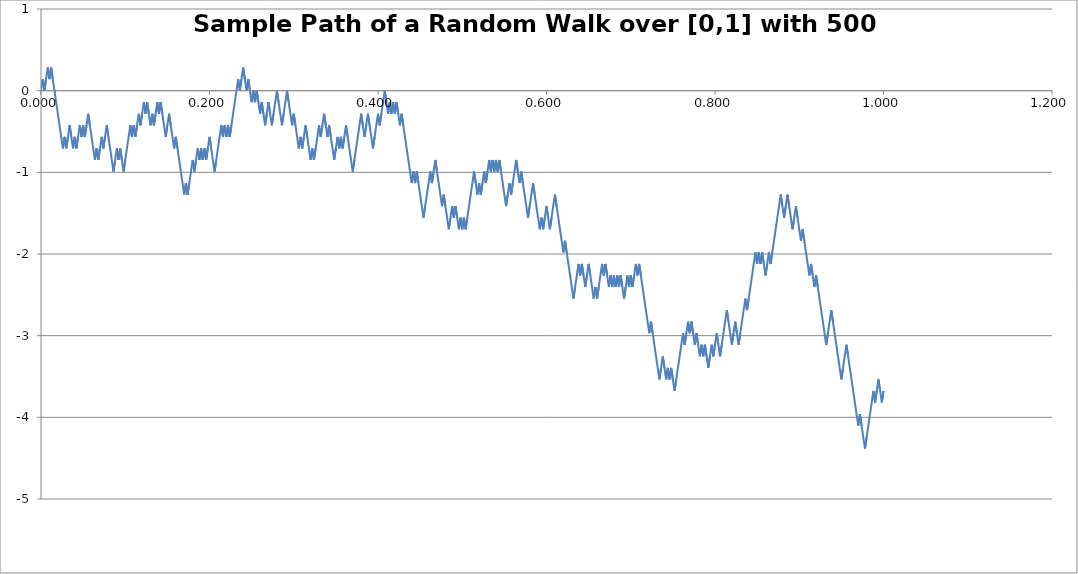
| Category | W_i |
|---|---|
| 0.0 | 0 |
| 0.002 | 0.141 |
| 0.004 | 0 |
| 0.006 | 0.141 |
| 0.008 | 0.283 |
| 0.01 | 0.141 |
| 0.012 | 0.283 |
| 0.014 | 0.141 |
| 0.016 | 0 |
| 0.018000000000000002 | -0.141 |
| 0.020000000000000004 | -0.283 |
| 0.022000000000000006 | -0.424 |
| 0.024000000000000007 | -0.566 |
| 0.02600000000000001 | -0.707 |
| 0.02800000000000001 | -0.566 |
| 0.030000000000000013 | -0.707 |
| 0.032000000000000015 | -0.566 |
| 0.034000000000000016 | -0.424 |
| 0.03600000000000002 | -0.566 |
| 0.03800000000000002 | -0.707 |
| 0.04000000000000002 | -0.566 |
| 0.04200000000000002 | -0.707 |
| 0.044000000000000025 | -0.566 |
| 0.04600000000000003 | -0.424 |
| 0.04800000000000003 | -0.566 |
| 0.05000000000000003 | -0.424 |
| 0.05200000000000003 | -0.566 |
| 0.054000000000000034 | -0.424 |
| 0.056000000000000036 | -0.283 |
| 0.05800000000000004 | -0.424 |
| 0.06000000000000004 | -0.566 |
| 0.06200000000000004 | -0.707 |
| 0.06400000000000004 | -0.849 |
| 0.06600000000000004 | -0.707 |
| 0.06800000000000005 | -0.849 |
| 0.07000000000000005 | -0.707 |
| 0.07200000000000005 | -0.566 |
| 0.07400000000000005 | -0.707 |
| 0.07600000000000005 | -0.566 |
| 0.07800000000000006 | -0.424 |
| 0.08000000000000006 | -0.566 |
| 0.08200000000000006 | -0.707 |
| 0.08400000000000006 | -0.849 |
| 0.08600000000000006 | -0.99 |
| 0.08800000000000006 | -0.849 |
| 0.09000000000000007 | -0.707 |
| 0.09200000000000007 | -0.849 |
| 0.09400000000000007 | -0.707 |
| 0.09600000000000007 | -0.849 |
| 0.09800000000000007 | -0.99 |
| 0.10000000000000007 | -0.849 |
| 0.10200000000000008 | -0.707 |
| 0.10400000000000008 | -0.566 |
| 0.10600000000000008 | -0.424 |
| 0.10800000000000008 | -0.566 |
| 0.11000000000000008 | -0.424 |
| 0.11200000000000009 | -0.566 |
| 0.11400000000000009 | -0.424 |
| 0.11600000000000009 | -0.283 |
| 0.11800000000000009 | -0.424 |
| 0.12000000000000009 | -0.283 |
| 0.1220000000000001 | -0.141 |
| 0.1240000000000001 | -0.283 |
| 0.12600000000000008 | -0.141 |
| 0.12800000000000009 | -0.283 |
| 0.1300000000000001 | -0.424 |
| 0.1320000000000001 | -0.283 |
| 0.1340000000000001 | -0.424 |
| 0.1360000000000001 | -0.283 |
| 0.1380000000000001 | -0.141 |
| 0.1400000000000001 | -0.283 |
| 0.1420000000000001 | -0.141 |
| 0.1440000000000001 | -0.283 |
| 0.1460000000000001 | -0.424 |
| 0.1480000000000001 | -0.566 |
| 0.1500000000000001 | -0.424 |
| 0.1520000000000001 | -0.283 |
| 0.1540000000000001 | -0.424 |
| 0.1560000000000001 | -0.566 |
| 0.1580000000000001 | -0.707 |
| 0.16000000000000011 | -0.566 |
| 0.16200000000000012 | -0.707 |
| 0.16400000000000012 | -0.849 |
| 0.16600000000000012 | -0.99 |
| 0.16800000000000012 | -1.131 |
| 0.17000000000000012 | -1.273 |
| 0.17200000000000013 | -1.131 |
| 0.17400000000000013 | -1.273 |
| 0.17600000000000013 | -1.131 |
| 0.17800000000000013 | -0.99 |
| 0.18000000000000013 | -0.849 |
| 0.18200000000000013 | -0.99 |
| 0.18400000000000014 | -0.849 |
| 0.18600000000000014 | -0.707 |
| 0.18800000000000014 | -0.849 |
| 0.19000000000000014 | -0.707 |
| 0.19200000000000014 | -0.849 |
| 0.19400000000000014 | -0.707 |
| 0.19600000000000015 | -0.849 |
| 0.19800000000000015 | -0.707 |
| 0.20000000000000015 | -0.566 |
| 0.20200000000000015 | -0.707 |
| 0.20400000000000015 | -0.849 |
| 0.20600000000000016 | -0.99 |
| 0.20800000000000016 | -0.849 |
| 0.21000000000000016 | -0.707 |
| 0.21200000000000016 | -0.566 |
| 0.21400000000000016 | -0.424 |
| 0.21600000000000016 | -0.566 |
| 0.21800000000000017 | -0.424 |
| 0.22000000000000017 | -0.566 |
| 0.22200000000000017 | -0.424 |
| 0.22400000000000017 | -0.566 |
| 0.22600000000000017 | -0.424 |
| 0.22800000000000017 | -0.283 |
| 0.23000000000000018 | -0.141 |
| 0.23200000000000018 | 0 |
| 0.23400000000000018 | 0.141 |
| 0.23600000000000018 | 0 |
| 0.23800000000000018 | 0.141 |
| 0.24000000000000019 | 0.283 |
| 0.2420000000000002 | 0.141 |
| 0.2440000000000002 | 0 |
| 0.2460000000000002 | 0.141 |
| 0.2480000000000002 | 0 |
| 0.25000000000000017 | -0.141 |
| 0.25200000000000017 | 0 |
| 0.25400000000000017 | -0.141 |
| 0.25600000000000017 | 0 |
| 0.2580000000000002 | -0.141 |
| 0.2600000000000002 | -0.283 |
| 0.2620000000000002 | -0.141 |
| 0.2640000000000002 | -0.283 |
| 0.2660000000000002 | -0.424 |
| 0.2680000000000002 | -0.283 |
| 0.2700000000000002 | -0.141 |
| 0.2720000000000002 | -0.283 |
| 0.2740000000000002 | -0.424 |
| 0.2760000000000002 | -0.283 |
| 0.2780000000000002 | -0.141 |
| 0.2800000000000002 | 0 |
| 0.2820000000000002 | -0.141 |
| 0.2840000000000002 | -0.283 |
| 0.2860000000000002 | -0.424 |
| 0.2880000000000002 | -0.283 |
| 0.2900000000000002 | -0.141 |
| 0.2920000000000002 | 0 |
| 0.2940000000000002 | -0.141 |
| 0.2960000000000002 | -0.283 |
| 0.2980000000000002 | -0.424 |
| 0.3000000000000002 | -0.283 |
| 0.3020000000000002 | -0.424 |
| 0.3040000000000002 | -0.566 |
| 0.3060000000000002 | -0.707 |
| 0.3080000000000002 | -0.566 |
| 0.3100000000000002 | -0.707 |
| 0.3120000000000002 | -0.566 |
| 0.3140000000000002 | -0.424 |
| 0.3160000000000002 | -0.566 |
| 0.3180000000000002 | -0.707 |
| 0.32000000000000023 | -0.849 |
| 0.32200000000000023 | -0.707 |
| 0.32400000000000023 | -0.849 |
| 0.32600000000000023 | -0.707 |
| 0.32800000000000024 | -0.566 |
| 0.33000000000000024 | -0.424 |
| 0.33200000000000024 | -0.566 |
| 0.33400000000000024 | -0.424 |
| 0.33600000000000024 | -0.283 |
| 0.33800000000000024 | -0.424 |
| 0.34000000000000025 | -0.566 |
| 0.34200000000000025 | -0.424 |
| 0.34400000000000025 | -0.566 |
| 0.34600000000000025 | -0.707 |
| 0.34800000000000025 | -0.849 |
| 0.35000000000000026 | -0.707 |
| 0.35200000000000026 | -0.566 |
| 0.35400000000000026 | -0.707 |
| 0.35600000000000026 | -0.566 |
| 0.35800000000000026 | -0.707 |
| 0.36000000000000026 | -0.566 |
| 0.36200000000000027 | -0.424 |
| 0.36400000000000027 | -0.566 |
| 0.36600000000000027 | -0.707 |
| 0.36800000000000027 | -0.849 |
| 0.3700000000000003 | -0.99 |
| 0.3720000000000003 | -0.849 |
| 0.3740000000000003 | -0.707 |
| 0.3760000000000003 | -0.566 |
| 0.3780000000000003 | -0.424 |
| 0.3800000000000003 | -0.283 |
| 0.3820000000000003 | -0.424 |
| 0.3840000000000003 | -0.566 |
| 0.3860000000000003 | -0.424 |
| 0.3880000000000003 | -0.283 |
| 0.3900000000000003 | -0.424 |
| 0.3920000000000003 | -0.566 |
| 0.3940000000000003 | -0.707 |
| 0.3960000000000003 | -0.566 |
| 0.3980000000000003 | -0.424 |
| 0.4000000000000003 | -0.283 |
| 0.4020000000000003 | -0.424 |
| 0.4040000000000003 | -0.283 |
| 0.4060000000000003 | -0.141 |
| 0.4080000000000003 | 0 |
| 0.4100000000000003 | -0.141 |
| 0.4120000000000003 | -0.283 |
| 0.4140000000000003 | -0.141 |
| 0.4160000000000003 | -0.283 |
| 0.4180000000000003 | -0.141 |
| 0.4200000000000003 | -0.283 |
| 0.4220000000000003 | -0.141 |
| 0.4240000000000003 | -0.283 |
| 0.4260000000000003 | -0.424 |
| 0.4280000000000003 | -0.283 |
| 0.4300000000000003 | -0.424 |
| 0.43200000000000033 | -0.566 |
| 0.43400000000000033 | -0.707 |
| 0.43600000000000033 | -0.849 |
| 0.43800000000000033 | -0.99 |
| 0.44000000000000034 | -1.131 |
| 0.44200000000000034 | -0.99 |
| 0.44400000000000034 | -1.131 |
| 0.44600000000000034 | -0.99 |
| 0.44800000000000034 | -1.131 |
| 0.45000000000000034 | -1.273 |
| 0.45200000000000035 | -1.414 |
| 0.45400000000000035 | -1.556 |
| 0.45600000000000035 | -1.414 |
| 0.45800000000000035 | -1.273 |
| 0.46000000000000035 | -1.131 |
| 0.46200000000000035 | -0.99 |
| 0.46400000000000036 | -1.131 |
| 0.46600000000000036 | -0.99 |
| 0.46800000000000036 | -0.849 |
| 0.47000000000000036 | -0.99 |
| 0.47200000000000036 | -1.131 |
| 0.47400000000000037 | -1.273 |
| 0.47600000000000037 | -1.414 |
| 0.47800000000000037 | -1.273 |
| 0.48000000000000037 | -1.414 |
| 0.4820000000000004 | -1.556 |
| 0.4840000000000004 | -1.697 |
| 0.4860000000000004 | -1.556 |
| 0.4880000000000004 | -1.414 |
| 0.4900000000000004 | -1.556 |
| 0.4920000000000004 | -1.414 |
| 0.4940000000000004 | -1.556 |
| 0.4960000000000004 | -1.697 |
| 0.4980000000000004 | -1.556 |
| 0.5000000000000003 | -1.697 |
| 0.5020000000000003 | -1.556 |
| 0.5040000000000003 | -1.697 |
| 0.5060000000000003 | -1.556 |
| 0.5080000000000003 | -1.414 |
| 0.5100000000000003 | -1.273 |
| 0.5120000000000003 | -1.131 |
| 0.5140000000000003 | -0.99 |
| 0.5160000000000003 | -1.131 |
| 0.5180000000000003 | -1.273 |
| 0.5200000000000004 | -1.131 |
| 0.5220000000000004 | -1.273 |
| 0.5240000000000004 | -1.131 |
| 0.5260000000000004 | -0.99 |
| 0.5280000000000004 | -1.131 |
| 0.5300000000000004 | -0.99 |
| 0.5320000000000004 | -0.849 |
| 0.5340000000000004 | -0.99 |
| 0.5360000000000004 | -0.849 |
| 0.5380000000000004 | -0.99 |
| 0.5400000000000004 | -0.849 |
| 0.5420000000000004 | -0.99 |
| 0.5440000000000004 | -0.849 |
| 0.5460000000000004 | -0.99 |
| 0.5480000000000004 | -1.131 |
| 0.5500000000000004 | -1.273 |
| 0.5520000000000004 | -1.414 |
| 0.5540000000000004 | -1.273 |
| 0.5560000000000004 | -1.131 |
| 0.5580000000000004 | -1.273 |
| 0.5600000000000004 | -1.131 |
| 0.5620000000000004 | -0.99 |
| 0.5640000000000004 | -0.849 |
| 0.5660000000000004 | -0.99 |
| 0.5680000000000004 | -1.131 |
| 0.5700000000000004 | -0.99 |
| 0.5720000000000004 | -1.131 |
| 0.5740000000000004 | -1.273 |
| 0.5760000000000004 | -1.414 |
| 0.5780000000000004 | -1.556 |
| 0.5800000000000004 | -1.414 |
| 0.5820000000000004 | -1.273 |
| 0.5840000000000004 | -1.131 |
| 0.5860000000000004 | -1.273 |
| 0.5880000000000004 | -1.414 |
| 0.5900000000000004 | -1.556 |
| 0.5920000000000004 | -1.697 |
| 0.5940000000000004 | -1.556 |
| 0.5960000000000004 | -1.697 |
| 0.5980000000000004 | -1.556 |
| 0.6000000000000004 | -1.414 |
| 0.6020000000000004 | -1.556 |
| 0.6040000000000004 | -1.697 |
| 0.6060000000000004 | -1.556 |
| 0.6080000000000004 | -1.414 |
| 0.6100000000000004 | -1.273 |
| 0.6120000000000004 | -1.414 |
| 0.6140000000000004 | -1.556 |
| 0.6160000000000004 | -1.697 |
| 0.6180000000000004 | -1.838 |
| 0.6200000000000004 | -1.98 |
| 0.6220000000000004 | -1.838 |
| 0.6240000000000004 | -1.98 |
| 0.6260000000000004 | -2.121 |
| 0.6280000000000004 | -2.263 |
| 0.6300000000000004 | -2.404 |
| 0.6320000000000005 | -2.546 |
| 0.6340000000000005 | -2.404 |
| 0.6360000000000005 | -2.263 |
| 0.6380000000000005 | -2.121 |
| 0.6400000000000005 | -2.263 |
| 0.6420000000000005 | -2.121 |
| 0.6440000000000005 | -2.263 |
| 0.6460000000000005 | -2.404 |
| 0.6480000000000005 | -2.263 |
| 0.6500000000000005 | -2.121 |
| 0.6520000000000005 | -2.263 |
| 0.6540000000000005 | -2.404 |
| 0.6560000000000005 | -2.546 |
| 0.6580000000000005 | -2.404 |
| 0.6600000000000005 | -2.546 |
| 0.6620000000000005 | -2.404 |
| 0.6640000000000005 | -2.263 |
| 0.6660000000000005 | -2.121 |
| 0.6680000000000005 | -2.263 |
| 0.6700000000000005 | -2.121 |
| 0.6720000000000005 | -2.263 |
| 0.6740000000000005 | -2.404 |
| 0.6760000000000005 | -2.263 |
| 0.6780000000000005 | -2.404 |
| 0.6800000000000005 | -2.263 |
| 0.6820000000000005 | -2.404 |
| 0.6840000000000005 | -2.263 |
| 0.6860000000000005 | -2.404 |
| 0.6880000000000005 | -2.263 |
| 0.6900000000000005 | -2.404 |
| 0.6920000000000005 | -2.546 |
| 0.6940000000000005 | -2.404 |
| 0.6960000000000005 | -2.263 |
| 0.6980000000000005 | -2.404 |
| 0.7000000000000005 | -2.263 |
| 0.7020000000000005 | -2.404 |
| 0.7040000000000005 | -2.263 |
| 0.7060000000000005 | -2.121 |
| 0.7080000000000005 | -2.263 |
| 0.7100000000000005 | -2.121 |
| 0.7120000000000005 | -2.263 |
| 0.7140000000000005 | -2.404 |
| 0.7160000000000005 | -2.546 |
| 0.7180000000000005 | -2.687 |
| 0.7200000000000005 | -2.828 |
| 0.7220000000000005 | -2.97 |
| 0.7240000000000005 | -2.828 |
| 0.7260000000000005 | -2.97 |
| 0.7280000000000005 | -3.111 |
| 0.7300000000000005 | -3.253 |
| 0.7320000000000005 | -3.394 |
| 0.7340000000000005 | -3.536 |
| 0.7360000000000005 | -3.394 |
| 0.7380000000000005 | -3.253 |
| 0.7400000000000005 | -3.394 |
| 0.7420000000000005 | -3.536 |
| 0.7440000000000005 | -3.394 |
| 0.7460000000000006 | -3.536 |
| 0.7480000000000006 | -3.394 |
| 0.7500000000000006 | -3.536 |
| 0.7520000000000006 | -3.677 |
| 0.7540000000000006 | -3.536 |
| 0.7560000000000006 | -3.394 |
| 0.7580000000000006 | -3.253 |
| 0.7600000000000006 | -3.111 |
| 0.7620000000000006 | -2.97 |
| 0.7640000000000006 | -3.111 |
| 0.7660000000000006 | -2.97 |
| 0.7680000000000006 | -2.828 |
| 0.7700000000000006 | -2.97 |
| 0.7720000000000006 | -2.828 |
| 0.7740000000000006 | -2.97 |
| 0.7760000000000006 | -3.111 |
| 0.7780000000000006 | -2.97 |
| 0.7800000000000006 | -3.111 |
| 0.7820000000000006 | -3.253 |
| 0.7840000000000006 | -3.111 |
| 0.7860000000000006 | -3.253 |
| 0.7880000000000006 | -3.111 |
| 0.7900000000000006 | -3.253 |
| 0.7920000000000006 | -3.394 |
| 0.7940000000000006 | -3.253 |
| 0.7960000000000006 | -3.111 |
| 0.7980000000000006 | -3.253 |
| 0.8000000000000006 | -3.111 |
| 0.8020000000000006 | -2.97 |
| 0.8040000000000006 | -3.111 |
| 0.8060000000000006 | -3.253 |
| 0.8080000000000006 | -3.111 |
| 0.8100000000000006 | -2.97 |
| 0.8120000000000006 | -2.828 |
| 0.8140000000000006 | -2.687 |
| 0.8160000000000006 | -2.828 |
| 0.8180000000000006 | -2.97 |
| 0.8200000000000006 | -3.111 |
| 0.8220000000000006 | -2.97 |
| 0.8240000000000006 | -2.828 |
| 0.8260000000000006 | -2.97 |
| 0.8280000000000006 | -3.111 |
| 0.8300000000000006 | -2.97 |
| 0.8320000000000006 | -2.828 |
| 0.8340000000000006 | -2.687 |
| 0.8360000000000006 | -2.546 |
| 0.8380000000000006 | -2.687 |
| 0.8400000000000006 | -2.546 |
| 0.8420000000000006 | -2.404 |
| 0.8440000000000006 | -2.263 |
| 0.8460000000000006 | -2.121 |
| 0.8480000000000006 | -1.98 |
| 0.8500000000000006 | -2.121 |
| 0.8520000000000006 | -1.98 |
| 0.8540000000000006 | -2.121 |
| 0.8560000000000006 | -1.98 |
| 0.8580000000000007 | -2.121 |
| 0.8600000000000007 | -2.263 |
| 0.8620000000000007 | -2.121 |
| 0.8640000000000007 | -1.98 |
| 0.8660000000000007 | -2.121 |
| 0.8680000000000007 | -1.98 |
| 0.8700000000000007 | -1.838 |
| 0.8720000000000007 | -1.697 |
| 0.8740000000000007 | -1.556 |
| 0.8760000000000007 | -1.414 |
| 0.8780000000000007 | -1.273 |
| 0.8800000000000007 | -1.414 |
| 0.8820000000000007 | -1.556 |
| 0.8840000000000007 | -1.414 |
| 0.8860000000000007 | -1.273 |
| 0.8880000000000007 | -1.414 |
| 0.8900000000000007 | -1.556 |
| 0.8920000000000007 | -1.697 |
| 0.8940000000000007 | -1.556 |
| 0.8960000000000007 | -1.414 |
| 0.8980000000000007 | -1.556 |
| 0.9000000000000007 | -1.697 |
| 0.9020000000000007 | -1.838 |
| 0.9040000000000007 | -1.697 |
| 0.9060000000000007 | -1.838 |
| 0.9080000000000007 | -1.98 |
| 0.9100000000000007 | -2.121 |
| 0.9120000000000007 | -2.263 |
| 0.9140000000000007 | -2.121 |
| 0.9160000000000007 | -2.263 |
| 0.9180000000000007 | -2.404 |
| 0.9200000000000007 | -2.263 |
| 0.9220000000000007 | -2.404 |
| 0.9240000000000007 | -2.546 |
| 0.9260000000000007 | -2.687 |
| 0.9280000000000007 | -2.828 |
| 0.9300000000000007 | -2.97 |
| 0.9320000000000007 | -3.111 |
| 0.9340000000000007 | -2.97 |
| 0.9360000000000007 | -2.828 |
| 0.9380000000000007 | -2.687 |
| 0.9400000000000007 | -2.828 |
| 0.9420000000000007 | -2.97 |
| 0.9440000000000007 | -3.111 |
| 0.9460000000000007 | -3.253 |
| 0.9480000000000007 | -3.394 |
| 0.9500000000000007 | -3.536 |
| 0.9520000000000007 | -3.394 |
| 0.9540000000000007 | -3.253 |
| 0.9560000000000007 | -3.111 |
| 0.9580000000000007 | -3.253 |
| 0.9600000000000007 | -3.394 |
| 0.9620000000000007 | -3.536 |
| 0.9640000000000007 | -3.677 |
| 0.9660000000000007 | -3.818 |
| 0.9680000000000007 | -3.96 |
| 0.9700000000000008 | -4.101 |
| 0.9720000000000008 | -3.96 |
| 0.9740000000000008 | -4.101 |
| 0.9760000000000008 | -4.243 |
| 0.9780000000000008 | -4.384 |
| 0.9800000000000008 | -4.243 |
| 0.9820000000000008 | -4.101 |
| 0.9840000000000008 | -3.96 |
| 0.9860000000000008 | -3.818 |
| 0.9880000000000008 | -3.677 |
| 0.9900000000000008 | -3.818 |
| 0.9920000000000008 | -3.677 |
| 0.9940000000000008 | -3.536 |
| 0.9960000000000008 | -3.677 |
| 0.9980000000000008 | -3.818 |
| 1.0000000000000007 | -3.677 |